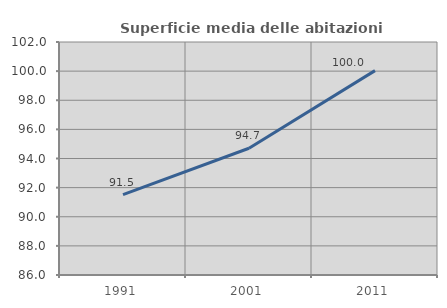
| Category | Superficie media delle abitazioni occupate |
|---|---|
| 1991.0 | 91.516 |
| 2001.0 | 94.702 |
| 2011.0 | 100.033 |